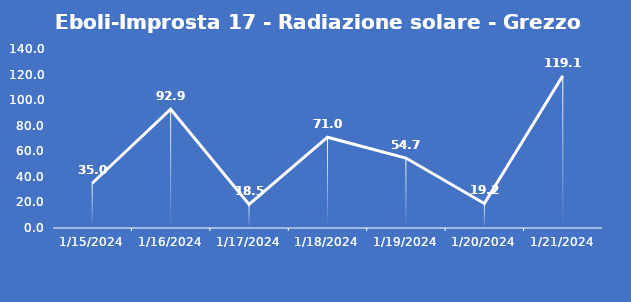
| Category | Eboli-Improsta 17 - Radiazione solare - Grezzo (W/m2) |
|---|---|
| 1/15/24 | 35 |
| 1/16/24 | 92.9 |
| 1/17/24 | 18.5 |
| 1/18/24 | 71 |
| 1/19/24 | 54.7 |
| 1/20/24 | 19.2 |
| 1/21/24 | 119.1 |